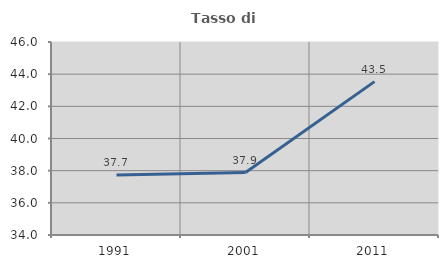
| Category | Tasso di occupazione   |
|---|---|
| 1991.0 | 37.733 |
| 2001.0 | 37.881 |
| 2011.0 | 43.535 |